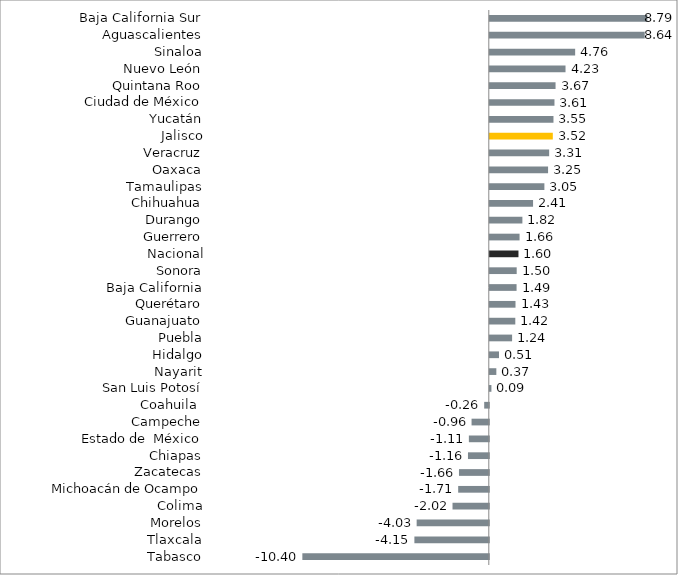
| Category | Series 0 |
|---|---|
|           Tabasco | -10.405 |
|           Tlaxcala | -4.152 |
|           Morelos | -4.026 |
|           Colima | -2.025 |
|           Michoacán de Ocampo | -1.709 |
|           Zacatecas | -1.665 |
|           Chiapas | -1.163 |
|          Estado de  México | -1.112 |
|           Campeche | -0.962 |
|           Coahuila  | -0.257 |
|           San Luis Potosí | 0.09 |
|           Nayarit | 0.365 |
|           Hidalgo | 0.513 |
|           Puebla | 1.244 |
|           Guanajuato | 1.424 |
|           Querétaro | 1.434 |
|           Baja California | 1.494 |
|           Sonora | 1.501 |
| Nacional | 1.6 |
|           Guerrero | 1.661 |
|           Durango | 1.819 |
|           Chihuahua | 2.414 |
|           Tamaulipas | 3.046 |
|           Oaxaca | 3.252 |
|           Veracruz | 3.312 |
|           Jalisco | 3.516 |
|           Yucatán | 3.553 |
|           Ciudad de México | 3.609 |
|           Quintana Roo | 3.669 |
|           Nuevo León | 4.225 |
|           Sinaloa | 4.763 |
|           Aguascalientes | 8.644 |
|           Baja California Sur | 8.792 |